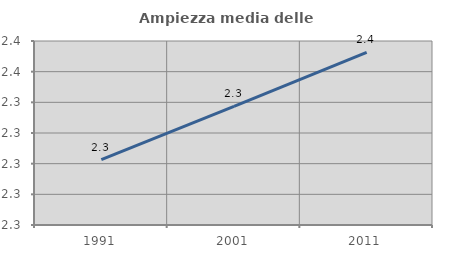
| Category | Ampiezza media delle famiglie |
|---|---|
| 1991.0 | 2.303 |
| 2001.0 | 2.337 |
| 2011.0 | 2.373 |